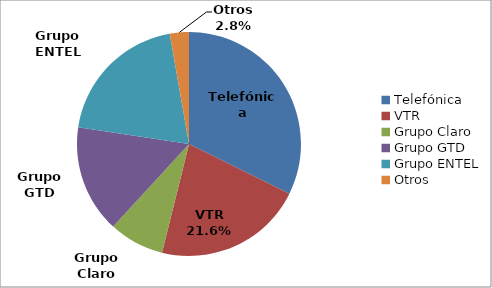
| Category | Series 0 |
|---|---|
| Telefónica | 623617 |
| VTR | 416283 |
| Grupo Claro | 153500 |
| Grupo GTD | 299820 |
| Grupo ENTEL | 383565 |
| Otros | 53126 |